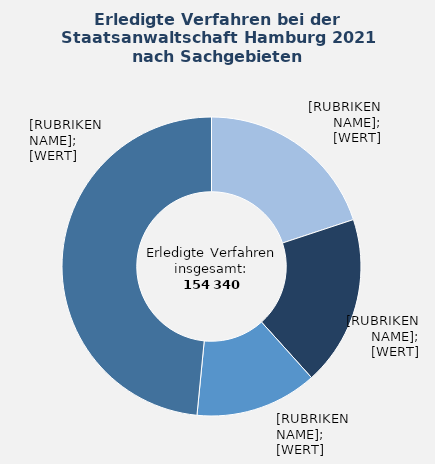
| Category | in Prozent |
|---|---|
| Sonstige allgemeine Straftaten | 19.9 |
| Betrug und Untreue | 18.4 |
| Diebstahl und Unterschlagung | 13.2 |
| Übrige Sachgebiete¹ | 48.4 |